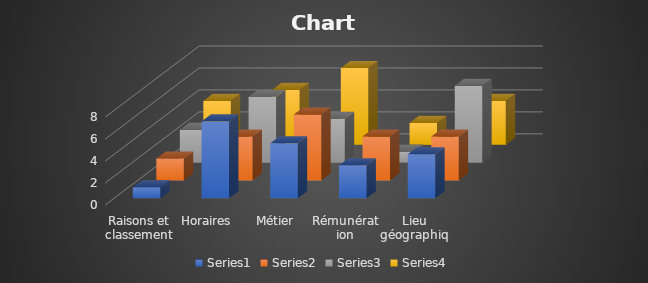
| Category | Series 0 | Series 1 | Series 2 | Series 3 |
|---|---|---|---|---|
| Raisons et classement | 1 | 2 | 3 | 4 |
| Horaires | 7 | 4 | 6 | 5 |
| Métier | 5 | 6 | 4 | 7 |
| Rémunération | 3 | 4 | 1 | 2 |
| Lieu géographique | 4 | 4 | 7 | 4 |